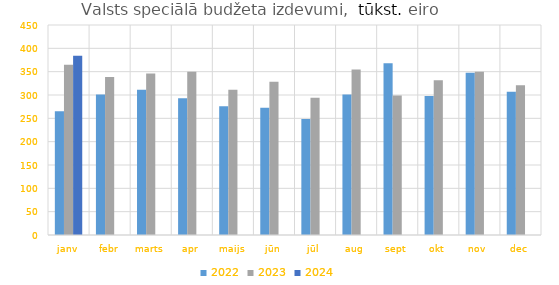
| Category | 2022 | 2023 | 2024 |
|---|---|---|---|
| janv | 265366.62 | 364905.213 | 384082.641 |
| febr | 301122.134 | 338753.3 | 0 |
| marts | 311449.105 | 346087.76 | 0 |
| apr | 292908.695 | 349816.348 | 0 |
| maijs | 276006.043 | 311041.84 | 0 |
| jūn | 272418.808 | 328139.664 | 0 |
| jūl | 248833.143 | 293936.464 | 0 |
| aug | 300867.01 | 354471.084 | 0 |
| sept | 368202.062 | 298878.279 | 0 |
| okt | 298051.418 | 331478.763 | 0 |
| nov | 347493.693 | 349793.266 | 0 |
| dec | 306911.749 | 320964.427 | 0 |